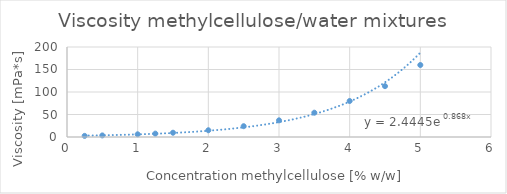
| Category | viscosity [mPa*s] |
|---|---|
| 0.25 | 2.5 |
| 0.5 | 3.5 |
| 1.0 | 6 |
| 1.25 | 7.5 |
| 1.5 | 9.5 |
| 2.0 | 15 |
| 2.5 | 24 |
| 3.0 | 37 |
| 3.5 | 54 |
| 4.0 | 80 |
| 4.5 | 113 |
| 5.0 | 160 |